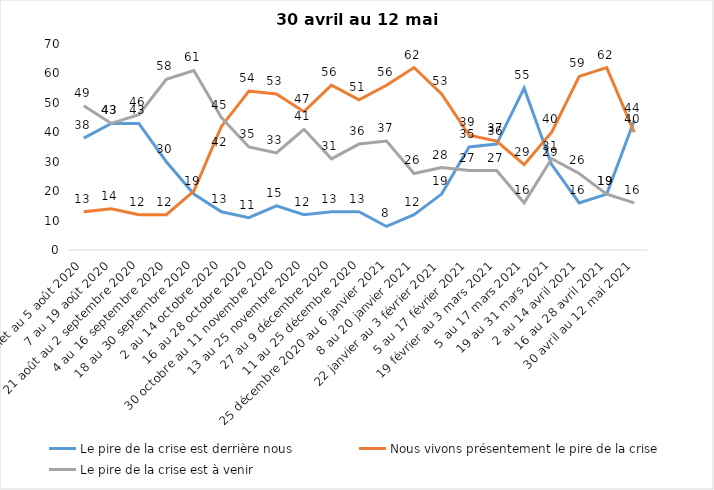
| Category | Le pire de la crise est derrière nous | Nous vivons présentement le pire de la crise | Le pire de la crise est à venir |
|---|---|---|---|
| 24 juillet au 5 août 2020 | 38 | 13 | 49 |
| 7 au 19 août 2020 | 43 | 14 | 43 |
| 21 août au 2 septembre 2020 | 43 | 12 | 46 |
| 4 au 16 septembre 2020 | 30 | 12 | 58 |
| 18 au 30 septembre 2020 | 19 | 20 | 61 |
| 2 au 14 octobre 2020 | 13 | 42 | 45 |
| 16 au 28 octobre 2020 | 11 | 54 | 35 |
| 30 octobre au 11 novembre 2020 | 15 | 53 | 33 |
| 13 au 25 novembre 2020 | 12 | 47 | 41 |
| 27 au 9 décembre 2020 | 13 | 56 | 31 |
| 11 au 25 décembre 2020 | 13 | 51 | 36 |
| 25 décembre 2020 au 6 janvier 2021 | 8 | 56 | 37 |
| 8 au 20 janvier 2021 | 12 | 62 | 26 |
| 22 janvier au 3 février 2021 | 19 | 53 | 28 |
| 5 au 17 février 2021 | 35 | 39 | 27 |
| 19 février au 3 mars 2021 | 36 | 37 | 27 |
| 5 au 17 mars 2021 | 55 | 29 | 16 |
| 19 au 31 mars 2021 | 29 | 40 | 31 |
| 2 au 14 avril 2021 | 16 | 59 | 26 |
| 16 au 28 avril 2021 | 19 | 62 | 19 |
| 30 avril au 12 mai 2021 | 44 | 40 | 16 |